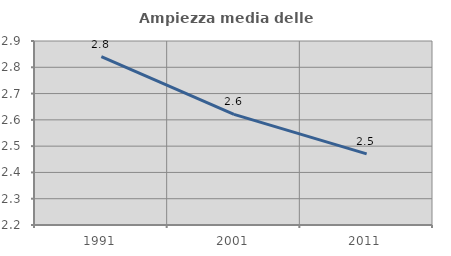
| Category | Ampiezza media delle famiglie |
|---|---|
| 1991.0 | 2.841 |
| 2001.0 | 2.621 |
| 2011.0 | 2.471 |